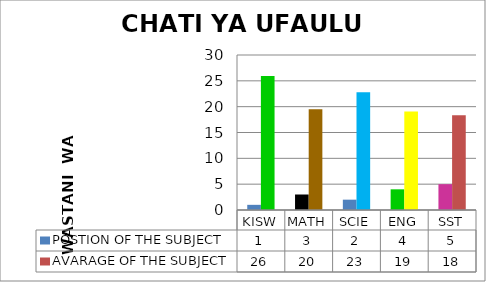
| Category | POSTION OF THE SUBJECT | AVARAGE OF THE SUBJECT |
|---|---|---|
| KISW | 1 | 25.956 |
| MATH | 3 | 19.506 |
| SCIE | 2 | 22.797 |
| ENG | 4 | 19.046 |
| SST | 5 | 18.347 |